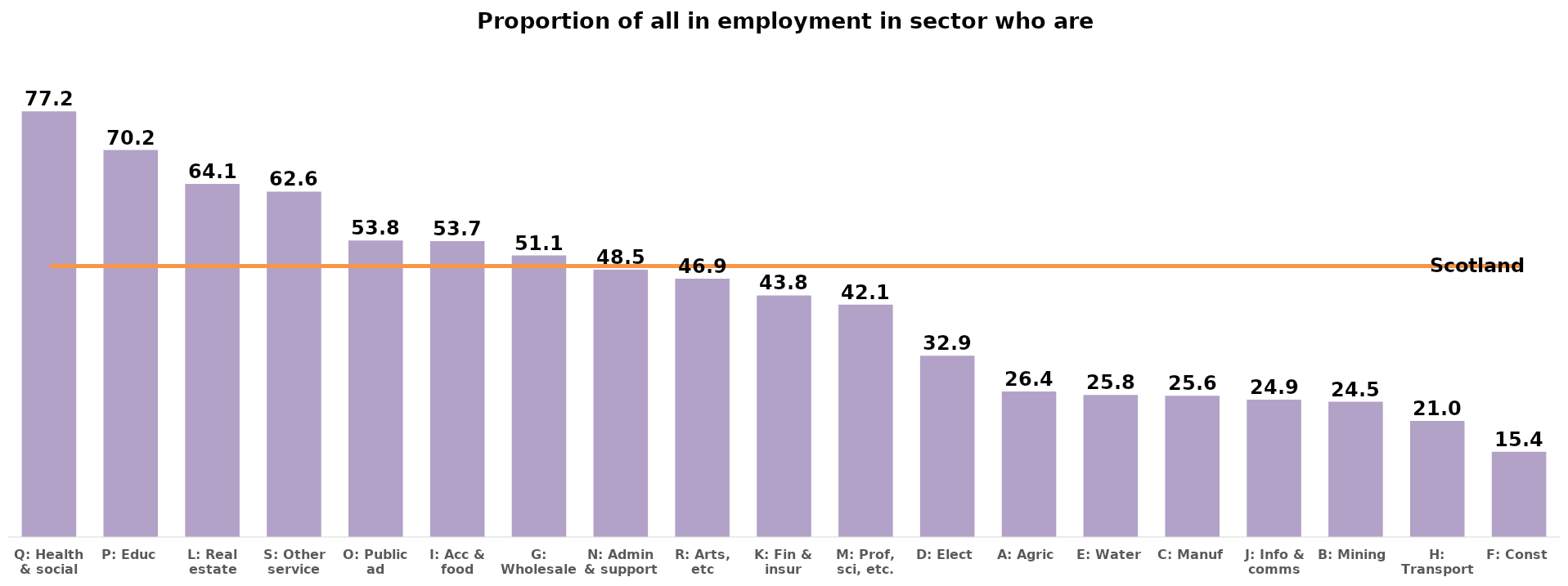
| Category | Series 0 |
|---|---|
| Q: Health & social | 77.224 |
| P: Educ | 70.201 |
| L: Real estate | 64.06 |
| S: Other service | 62.648 |
| O: Public ad | 53.77 |
| I: Acc & food | 53.665 |
| G: Wholesale | 51.068 |
| N: Admin & support | 48.488 |
| R: Arts, etc | 46.856 |
| K: Fin & insur | 43.827 |
| M: Prof, sci, etc. | 42.13 |
| D: Elect | 32.895 |
| A: Agric | 26.393 |
| E: Water | 25.752 |
| C: Manuf | 25.596 |
| J: Info & comms | 24.913 |
| B: Mining | 24.526 |
| H: Transport | 21.038 |
| F: Const | 15.446 |